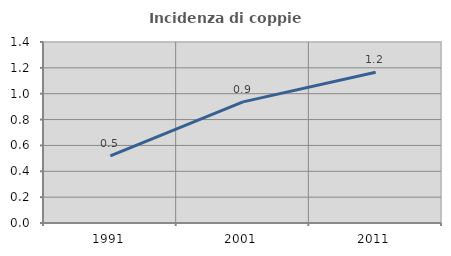
| Category | Incidenza di coppie miste |
|---|---|
| 1991.0 | 0.519 |
| 2001.0 | 0.937 |
| 2011.0 | 1.166 |